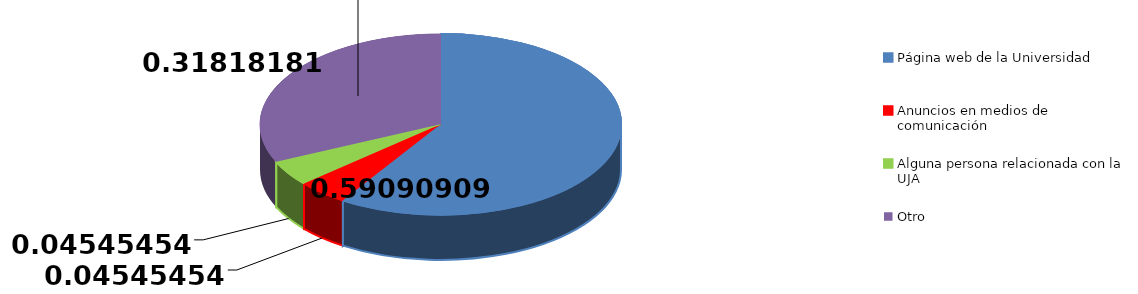
| Category | Frecuencia | Series 1 |
|---|---|---|
| Página web de la Universidad | 13 |  |
| Anuncios en medios de comunicación | 1 |  |
| Alguna persona relacionada con la UJA | 1 |  |
| Otro | 7 |  |